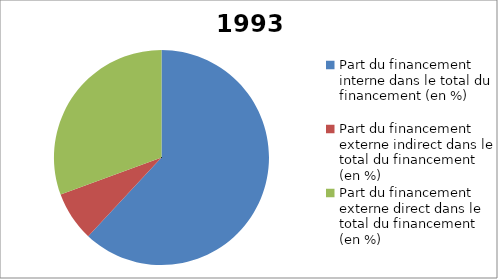
| Category | 1993 |
|---|---|
| Part du financement interne dans le total du financement (en %) | 61.94 |
| Part du financement externe indirect dans le total du financement (en %) | 7.463 |
| Part du financement externe direct dans le total du financement (en %) | 30.597 |